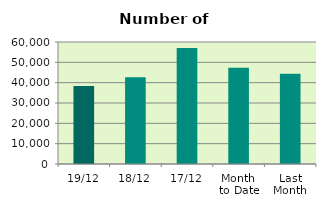
| Category | Series 0 |
|---|---|
| 19/12 | 38320 |
| 18/12 | 42660 |
| 17/12 | 57104 |
| Month 
to Date | 47290.571 |
| Last
Month | 44331.238 |